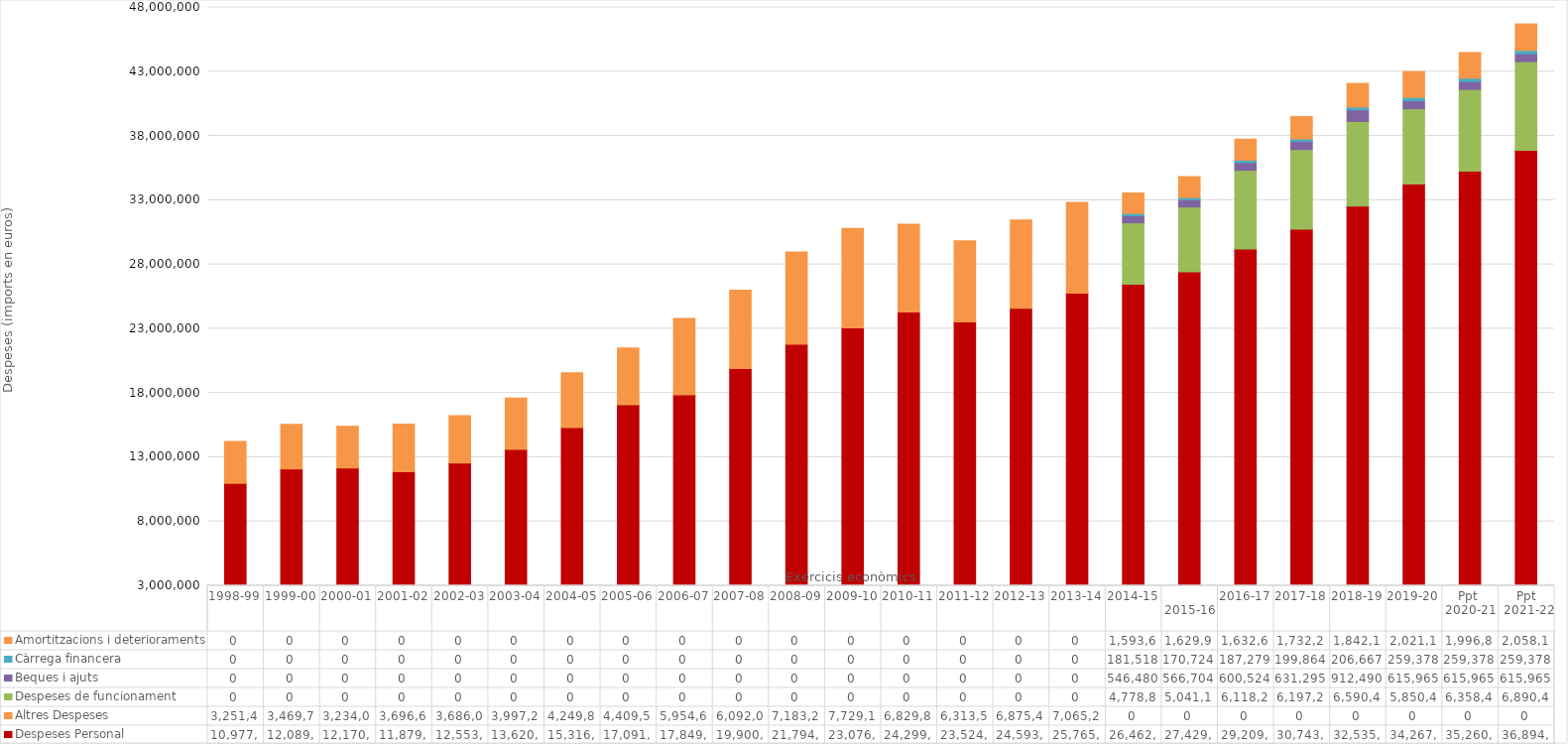
| Category | Despeses Personal | Altres Despeses | Despeses de funcionament | Beques i ajuts | Càrrega financera | Amortitzacions i deterioraments |
|---|---|---|---|---|---|---|
| 1998-99 | 10977452.989 | 3251431.752 | 0 | 0 | 0 | 0 |
| 1999-00 | 12089108.08 | 3469787.656 | 0 | 0 | 0 | 0 |
| 2000-01 | 12170972.564 | 3234049.565 | 0 | 0 | 0 | 0 |
| 2001-02 | 11879474.41 | 3696648.32 | 0 | 0 | 0 | 0 |
| 2002-03 | 12553039.83 | 3686008.64 | 0 | 0 | 0 | 0 |
| 2003-04 | 13620011.08 | 3997201.83 | 0 | 0 | 0 | 0 |
| 2004-05 | 15316958.27 | 4249862.05 | 0 | 0 | 0 | 0 |
| 2005-06 | 17091844.41 | 4409547.38 | 0 | 0 | 0 | 0 |
| 2006-07 | 17849602 | 5954636 | 0 | 0 | 0 | 0 |
| 2007-08 | 19900360 | 6092060 | 0 | 0 | 0 | 0 |
| 2008-09 | 21794903 | 7183222 | 0 | 0 | 0 | 0 |
| 2009-10 | 23076772 | 7729148 | 0 | 0 | 0 | 0 |
| 2010-11 | 24299165.8 | 6829887.33 | 0 | 0 | 0 | 0 |
| 2011-12 | 23524439.98 | 6313576.52 | 0 | 0 | 0 | 0 |
| 2012-13 | 24593132.91 | 6875407.37 | 0 | 0 | 0 | 0 |
| 2013-14 | 25765543 | 7065252.66 | 0 | 0 | 0 | 0 |
| 2014-15  | 26462368 | 0 | 4778852 | 546480 | 181518 | 1593648 |
|   2015-16 | 27429404 | 0 | 5041176 | 566704 | 170724 | 1629947 |
| 2016-17 | 29209692 | 0 | 6118286 | 600524 | 187279 | 1632692 |
| 2017-18 | 30743310 | 0 | 6197229 | 631295 | 199864 | 1732221 |
| 2018-19 | 32535958 | 0 | 6590419 | 912490 | 206667 | 1842176 |
| 2019-20 | 34267863.4 | 0 | 5850428 | 615964.96 | 259378 | 2021147 |
| Ppt 
2020-21 | 35260440 | 0 | 6358419 | 615965 | 259378 | 1996899 |
| Ppt
 2021-22 | 36894400 | 0 | 6890419 | 615965 | 259378 | 2058198 |